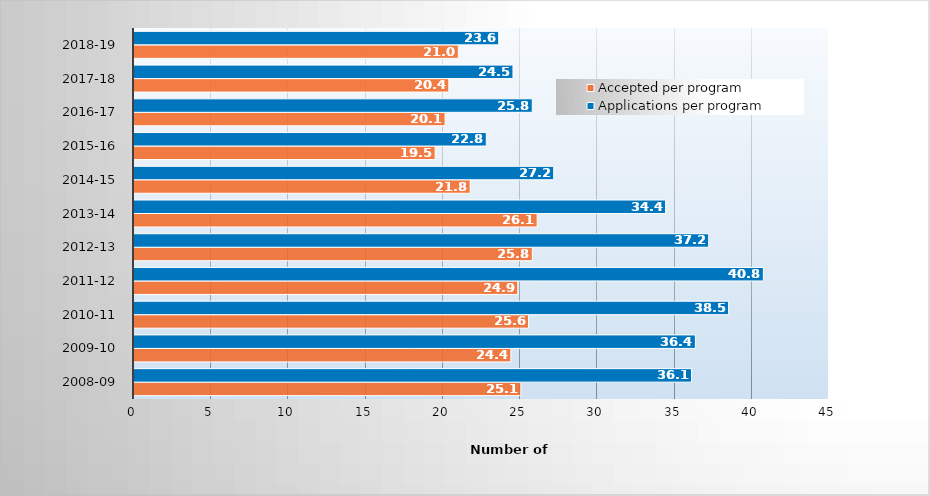
| Category | Accepted per program | Applications per program |
|---|---|---|
| 2008-09 | 25.05 | 36.1 |
| 2009-10 | 24.4 | 36.35 |
| 2010-11 | 25.55 | 38.5 |
| 2011-12 | 24.85 | 40.75 |
| 2012-13 | 25.789 | 37.211 |
| 2013-14 | 26.105 | 34.421 |
| 2014-15 | 21.765 | 27.176 |
| 2015-16 | 19.5 | 22.812 |
| 2016-17 | 20.143 | 25.786 |
| 2017-18 | 20.385 | 24.538 |
| 2018-19 | 21 | 23.615 |